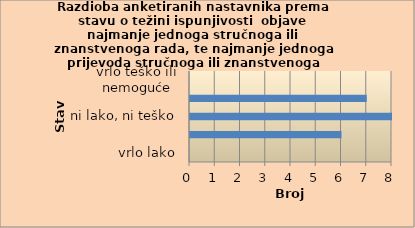
| Category | Series 0 |
|---|---|
| vrlo lako | 0 |
| lako | 6 |
| ni lako, ni teško | 8 |
| teško | 7 |
| vrlo teško ili nemoguće | 0 |